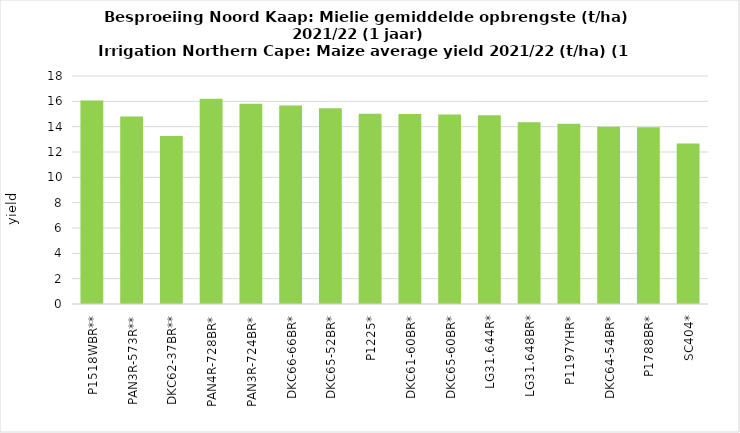
| Category | Series 0 |
|---|---|
| P1518WBR** | 16.073 |
| PAN3R-573R** | 14.81 |
| DKC62-37BR** | 13.26 |
| PAN4R-728BR* | 16.202 |
| PAN3R-724BR* | 15.818 |
| DKC66-66BR* | 15.678 |
| DKC65-52BR* | 15.463 |
| P1225* | 15.028 |
| DKC61-60BR* | 15.005 |
| DKC65-60BR* | 14.952 |
| LG31.644R* | 14.91 |
| LG31.648BR* | 14.353 |
| P1197YHR* | 14.238 |
| DKC64-54BR* | 13.985 |
| P1788BR* | 13.945 |
| SC404* | 12.665 |